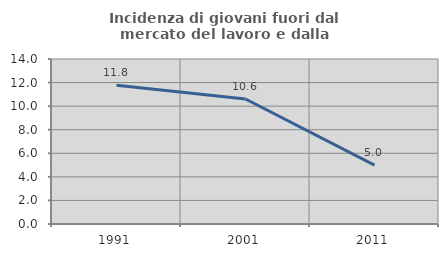
| Category | Incidenza di giovani fuori dal mercato del lavoro e dalla formazione  |
|---|---|
| 1991.0 | 11.765 |
| 2001.0 | 10.606 |
| 2011.0 | 5 |